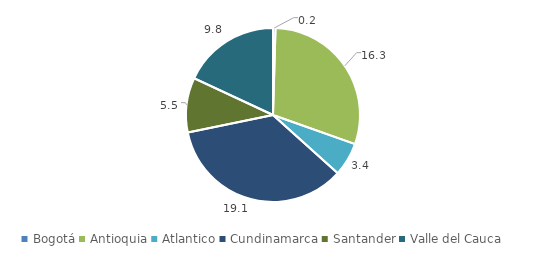
| Category | Series 0 |
|---|---|
| Bogotá | 0.25 |
| Antioquia | 16.263 |
| Atlantico | 3.381 |
| Cundinamarca | 19.055 |
| Santander | 5.523 |
| Valle del Cauca | 9.797 |